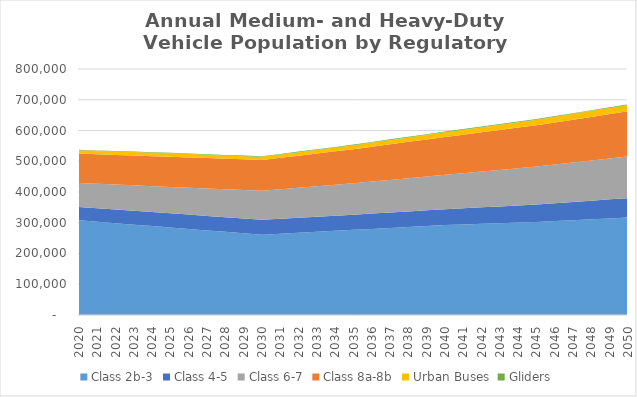
| Category | Class 2b-3 | Class 4-5 | Class 6-7 | Class 8a-8b | Urban Buses | Gliders |
|---|---|---|---|---|---|---|
| 2020.0 | 307980 | 43360 | 77860 | 95610 | 11170 | 1290 |
| 2021.0 | 303290 | 43910 | 79460 | 96080 | 11230 | 1340 |
| 2022.0 | 298590 | 44460 | 81070 | 96550 | 11290 | 1390 |
| 2023.0 | 293900 | 45000 | 82670 | 97010 | 11340 | 1450 |
| 2024.0 | 289200 | 45550 | 84280 | 97480 | 11400 | 1500 |
| 2025.0 | 284510 | 46100 | 85880 | 97950 | 11460 | 1550 |
| 2026.0 | 279820 | 46650 | 87490 | 98420 | 11220 | 1600 |
| 2027.0 | 275130 | 47200 | 89090 | 98890 | 10970 | 1660 |
| 2028.0 | 270430 | 47750 | 90700 | 99350 | 10730 | 1710 |
| 2029.0 | 265740 | 48300 | 92300 | 99820 | 10480 | 1770 |
| 2030.0 | 261050 | 48850 | 93910 | 100290 | 10240 | 1820 |
| 2031.0 | 264210 | 48950 | 95530 | 102450 | 10770 | 1850 |
| 2032.0 | 267370 | 49050 | 97160 | 104600 | 11300 | 1880 |
| 2033.0 | 270530 | 49160 | 98780 | 106760 | 11840 | 1910 |
| 2034.0 | 273690 | 49260 | 100410 | 108910 | 12370 | 1940 |
| 2035.0 | 276850 | 49360 | 102030 | 111070 | 12900 | 1970 |
| 2036.0 | 279960 | 49810 | 104020 | 113420 | 13470 | 1990 |
| 2037.0 | 283070 | 50260 | 106010 | 115760 | 14030 | 2010 |
| 2038.0 | 286190 | 50720 | 107990 | 118110 | 14600 | 2020 |
| 2039.0 | 289300 | 51170 | 109980 | 120450 | 15160 | 2040 |
| 2040.0 | 292410 | 51620 | 111970 | 122800 | 15730 | 2060 |
| 2041.0 | 294440 | 52650 | 114220 | 125150 | 16200 | 2060 |
| 2042.0 | 296470 | 53680 | 116470 | 127500 | 16670 | 2050 |
| 2043.0 | 298490 | 54700 | 118730 | 129860 | 17140 | 2050 |
| 2044.0 | 300520 | 55730 | 120980 | 132210 | 17610 | 2040 |
| 2045.0 | 302550 | 56760 | 123230 | 134560 | 18080 | 2040 |
| 2046.0 | 305430 | 58060 | 125720 | 136960 | 18570 | 2020 |
| 2047.0 | 308310 | 59360 | 128210 | 139350 | 19060 | 2010 |
| 2048.0 | 311180 | 60670 | 130700 | 141750 | 19540 | 1990 |
| 2049.0 | 314060 | 61970 | 133190 | 144140 | 20030 | 1980 |
| 2050.0 | 316940 | 63270 | 135680 | 146540 | 20520 | 1960 |